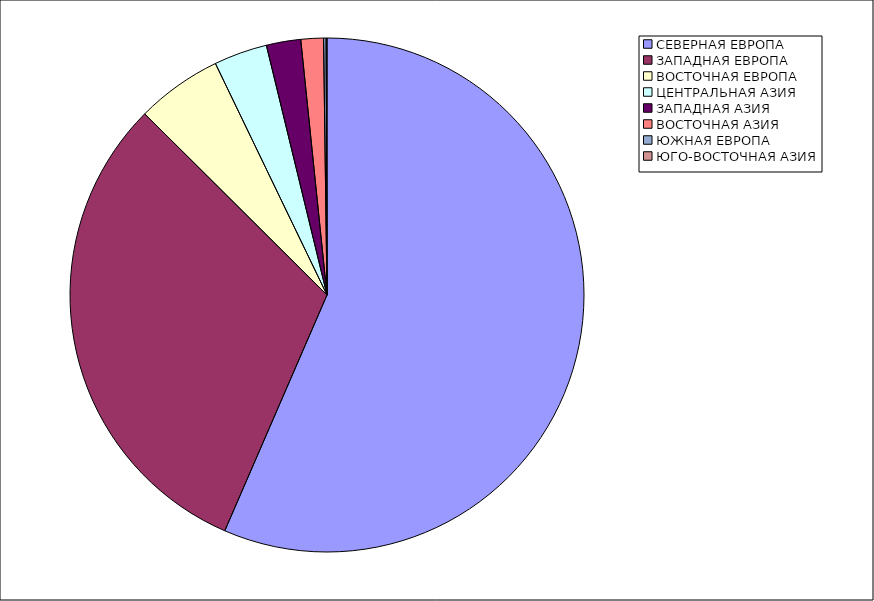
| Category | Оборот |
|---|---|
| СЕВЕРНАЯ ЕВРОПА | 56.51 |
| ЗАПАДНАЯ ЕВРОПА | 30.94 |
| ВОСТОЧНАЯ ЕВРОПА | 5.4 |
| ЦЕНТРАЛЬНАЯ АЗИЯ | 3.358 |
| ЗАПАДНАЯ АЗИЯ | 2.163 |
| ВОСТОЧНАЯ АЗИЯ | 1.416 |
| ЮЖНАЯ ЕВРОПА | 0.159 |
| ЮГО-ВОСТОЧНАЯ АЗИЯ | 0.055 |